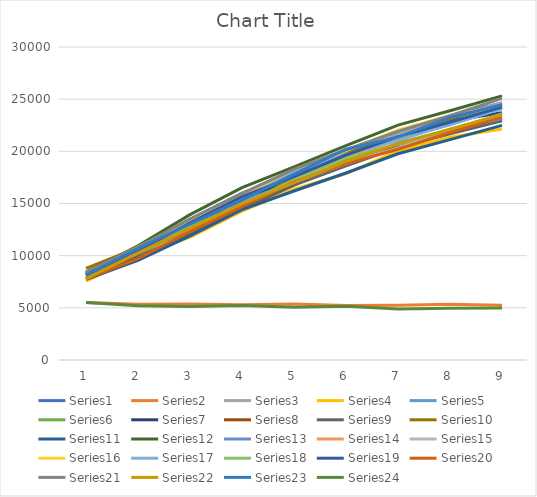
| Category | Series 0 | Series 1 | Series 2 | Series 3 | Series 4 | Series 5 | Series 6 | Series 7 | Series 8 | Series 9 | Series 10 | Series 11 | Series 12 | Series 13 | Series 14 | Series 15 | Series 16 | Series 17 | Series 18 | Series 19 | Series 20 | Series 21 | Series 22 | Series 23 |
|---|---|---|---|---|---|---|---|---|---|---|---|---|---|---|---|---|---|---|---|---|---|---|---|---|
| 0 | 8418 | 5514 | 8283 | 7558 | 8273 | 7797 | 8288 | 8168 | 7791 | 8773 | 7726 | 8384 | 7830 | 8360 | 7837 | 8211 | 8174 | 8000 | 8118 | 7781 | 8377 | 7808 | 8152 | 5509 |
| 1 | 10801 | 5355 | 10795 | 9914 | 10918 | 10218 | 10358 | 10284 | 9936 | 10761 | 9558 | 10939 | 10359 | 10835 | 10294 | 10523 | 10444 | 10268 | 10440 | 9723 | 10813 | 10269 | 10705 | 5195 |
| 2 | 13492 | 5378 | 13138 | 11778 | 13103 | 12517 | 12738 | 12559 | 12076 | 13433 | 11893 | 13936 | 12635 | 13241 | 12651 | 13285 | 13119 | 12831 | 13159 | 12314 | 13512 | 12610 | 13014 | 5121 |
| 3 | 15987 | 5287 | 15509 | 14263 | 15268 | 14734 | 15487 | 14470 | 14580 | 15854 | 14406 | 16529 | 14887 | 15724 | 15007 | 15935 | 15435 | 14825 | 15656 | 14703 | 15970 | 14979 | 15321 | 5218 |
| 4 | 17726 | 5359 | 17676 | 16364 | 17337 | 16850 | 17355 | 16763 | 16759 | 17335 | 16195 | 18509 | 17225 | 17735 | 17029 | 17971 | 17953 | 17293 | 17585 | 17070 | 18273 | 17009 | 17816 | 5059 |
| 5 | 19831 | 5214 | 20023 | 17857 | 19864 | 18816 | 19365 | 19079 | 18618 | 20012 | 17924 | 20550 | 18813 | 19400 | 18834 | 20066 | 19681 | 19364 | 19647 | 18818 | 20152 | 19050 | 20199 | 5141 |
| 6 | 21721 | 5246 | 21728 | 20044 | 21241 | 20465 | 21276 | 20393 | 20368 | 21331 | 19769 | 22512 | 20802 | 21093 | 20333 | 22020 | 21045 | 20690 | 21414 | 20205 | 21910 | 20738 | 21360 | 4900 |
| 7 | 23428 | 5343 | 23151 | 21347 | 22547 | 21820 | 22928 | 21763 | 21688 | 23107 | 21127 | 23888 | 22023 | 23398 | 22047 | 23432 | 22579 | 22094 | 22784 | 21802 | 23412 | 22119 | 23242 | 4969 |
| 8 | 24635 | 5254 | 24664 | 22139 | 24139 | 23159 | 23706 | 23128 | 22936 | 24456 | 22484 | 25321 | 23155 | 24252 | 23580 | 24350 | 24071 | 23534 | 24236 | 23284 | 25082 | 23519 | 24471 | 4981 |